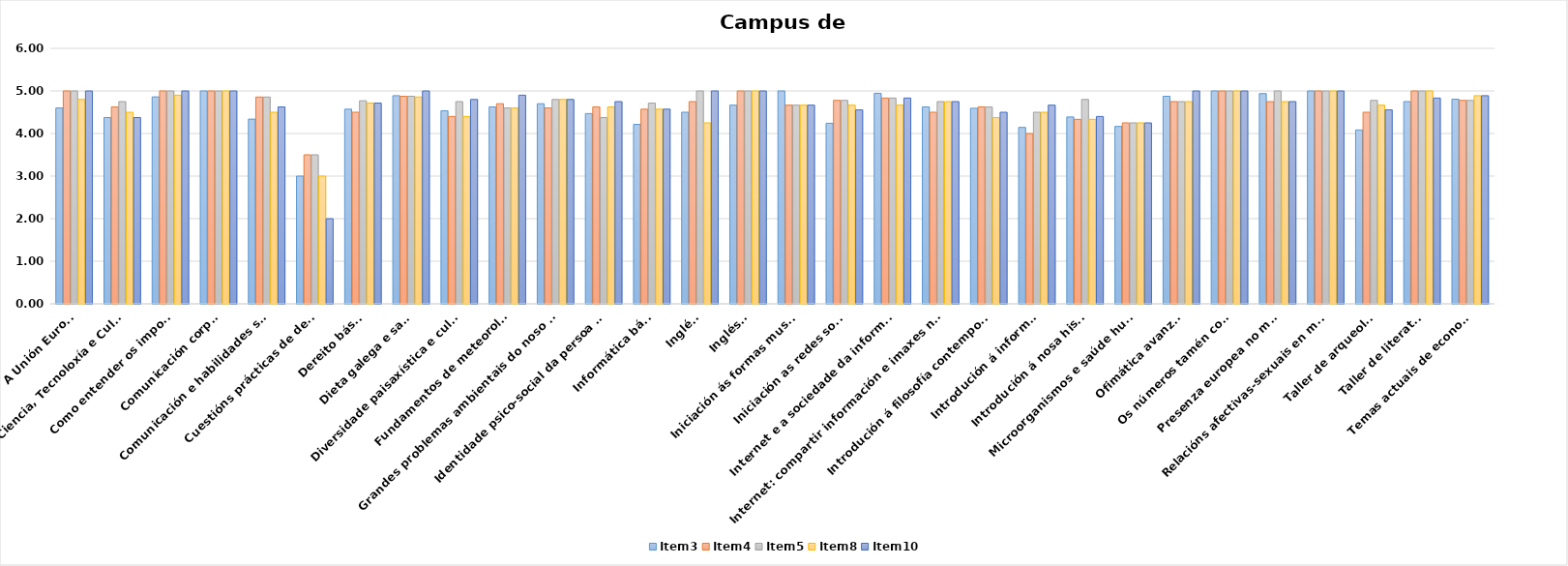
| Category | Item3 | Item4 | Item5 | Item8 | Item10 |
|---|---|---|---|---|---|
| A nosa cidade e as súas cousas | 4.5 | 4.778 | 4.667 | 4.889 | 4.556 |
| Claves para entender a publicidade | 4.344 | 4.875 | 4.75 | 4.625 | 4.5 |
| Comunicación audiovisual | 2.75 | 4.143 | 3.857 | 3.286 | 3 |
| Cultura e pensamento | 4.312 | 4.625 | 4.125 | 4.5 | 4.5 |
| Dar máis vida á vida. Convivencia e resolución pacíficas de conflitos | 4.479 | 4.75 | 5 | 4.5 | 4.75 |
| Europa: significado, historia e cultura | 4.529 | 4.5 | 4.7 | 4.6 | 4.474 |
| Filosofía da ciencia, cultura e tecnoloxía | 4.269 | 4.538 | 4.462 | 4.615 | 4.231 |
| Grandes problemas ambientais do noso tempo | 4.4 | 4.8 | 5 | 5 | 4.5 |
| Gravado e estampación. Métodos directos | 5 | 5 | 5 | 5 | 5 |
| Historia moderna e contemporánea de España | 4.667 | 4.75 | 4.5 | 4.5 | 4.5 |
| Inglés elemental | 4.857 | 5 | 5 | 4.75 | 4.857 |
| Inglés para principiantes | 4.861 | 5 | 5 | 4.778 | 4.875 |
| Iniciación á fotografía | 3.5 | 4 | 4 | 3 | 4 |
| Introdución á filosofía do dereito | 4.45 | 4.7 | 4.9 | 4.8 | 4.7 |
| Introdución á historia da arte | 4.681 | 4.696 | 4.75 | 4.708 | 4.696 |
| Introdución á nosa historia | 3.514 | 4 | 4.333 | 4.2 | 3.5 |
| Introdución ás novas tecnoloxías II | 4.917 | 5 | 5 | 5 | 4.667 |
| Olladas sobre a literatura galega | 4.8 | 4.8 | 5 | 4.6 | 4.6 |
| Pilates en persoas maiores | 4.778 | 4.833 | 5 | 4.75 | 5 |
| Psicoloxía da persoa adulta I | 4.375 | 4.333 | 4.5 | 4.6 | 4.333 |
| Saúde e calidade de vida | 3.852 | 4.1 | 4.053 | 4.1 | 4.1 |
| Xeografía de Galicia: paisaxes naturais e humanas | 4.233 | 4.6 | 4.6 | 5 | 4.25 |